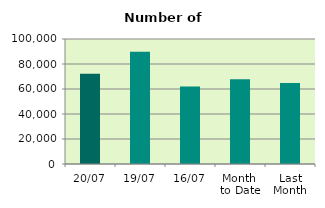
| Category | Series 0 |
|---|---|
| 20/07 | 72166 |
| 19/07 | 89864 |
| 16/07 | 62008 |
| Month 
to Date | 67868.286 |
| Last
Month | 64737.364 |